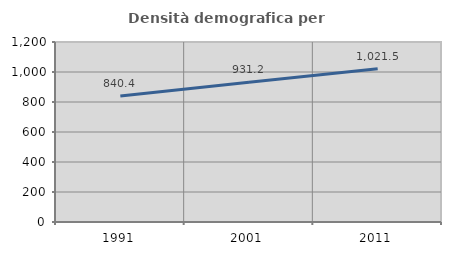
| Category | Densità demografica |
|---|---|
| 1991.0 | 840.418 |
| 2001.0 | 931.19 |
| 2011.0 | 1021.52 |